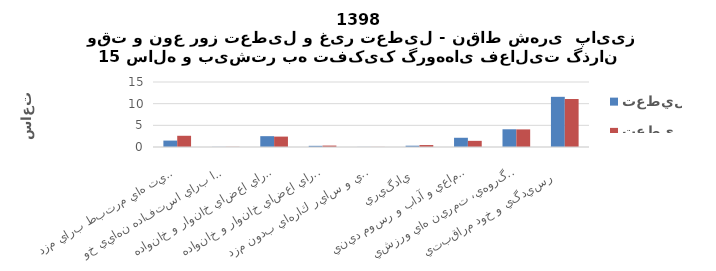
| Category | تعطيل | غير تعطيل |
|---|---|---|
| اشتغال و فعاليت هاي مرتبط براي مزد  | 1.48 | 2.59 |
| توليد كالا براي استفاده نهايي خود   | 0.03 | 0.04 |
| خدمات خانگي بدون مزد براي اعضاي خانوار و خانواده   | 2.5 | 2.4 |
| خدمات مراقبتي بدون مزد براي اعضاي خانوار و خانواده   | 0.27 | 0.33 |
| كارداوطلبانه بدون مزد، كار آموزي و ساير كارهاي بدون مزد  | 0.02 | 0.02 |
| يادگيري  | 0.3 | 0.45 |
| معاشرت، ارتباط، مشاركت اجتماعي و آداب و رسوم ديني  | 2.13 | 1.42 |
| فرهنگ، فراغت، رسانه هاي گروهي، تمرين هاي ورزشي  | 4.09 | 4.06 |
| رسيدگي و خود مراقبتي   | 11.58 | 11.08 |